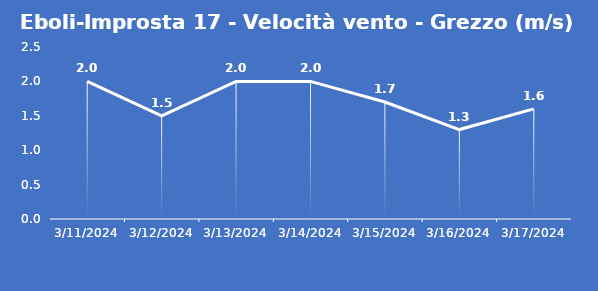
| Category | Eboli-Improsta 17 - Velocità vento - Grezzo (m/s) |
|---|---|
| 3/11/24 | 2 |
| 3/12/24 | 1.5 |
| 3/13/24 | 2 |
| 3/14/24 | 2 |
| 3/15/24 | 1.7 |
| 3/16/24 | 1.3 |
| 3/17/24 | 1.6 |